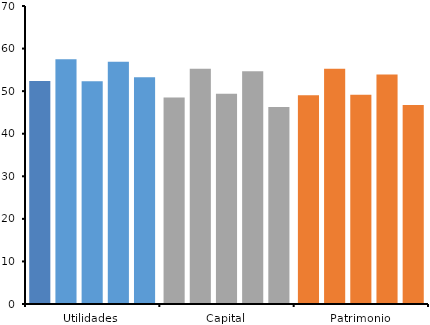
| Category | 2013 | 2014 | Series 2 | 2016 | 2017 |
|---|---|---|---|---|---|
| Utilidades | 52.399 | 57.472 | 52.307 | 56.908 | 53.236 |
| Capital | 48.523 | 55.243 | 49.361 | 54.685 | 46.293 |
| Patrimonio | 49.02 | 55.238 | 49.148 | 53.927 | 46.769 |